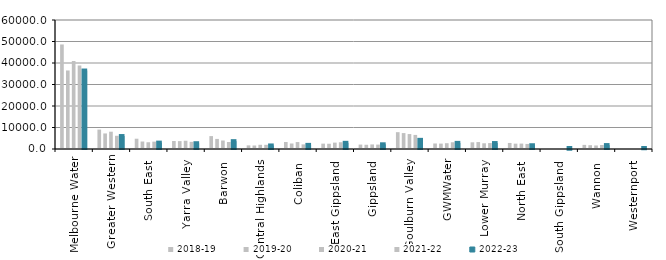
| Category | 2018-19 | 2019-20 | 2020-21 | 2021-22 | 2022-23 |
|---|---|---|---|---|---|
| Melbourne Water | 48624 | 36529.7 | 40930 | 38837 | 36501 |
| Greater Western | 9025 | 7233.46 | 8048.947 | 6146.236 | 6025.45 |
| South East  | 4785.75 | 3472.8 | 3140.2 | 3424.7 | 2967.428 |
| Yarra Valley  | 3720.784 | 3666.041 | 3838.411 | 3323.599 | 2693.949 |
| Barwon  | 5997.717 | 4683.041 | 3951.486 | 3265.994 | 3648.185 |
| Central Highlands  | 1680.245 | 1625.6 | 1958.508 | 1945.561 | 1645.465 |
| Coliban  | 3261.4 | 2564 | 3229 | 2148.9 | 1918.8 |
| East Gippsland  | 2496.222 | 2437.581 | 2968.827 | 3139.31 | 2871.77 |
| Gippsland  | 2054.436 | 1968.857 | 2127.813 | 2049.4 | 2183.946 |
| Goulburn Valley  | 7821.29 | 7401.44 | 6953.45 | 6546.75 | 4255.55 |
| GWMWater | 2568.62 | 2509.354 | 2697.672 | 3132.542 | 2845.28 |
| Lower Murray  | 3110.337 | 3227.753 | 2659.002 | 2759.394 | 2768.73 |
| North East  | 2810.58 | 2487.775 | 2515.63 | 2355.78 | 1748.11 |
| South Gippsland  | 124 | 121.959 | 193.63 | 189.454 | 115.551 |
| Wannon  | 1915.361 | 1773.1 | 1634.916 | 1867.833 | 1826.913 |
| Westernport  | 340.435 | 220.992 | 125.45 | 303.183 | 348.037 |